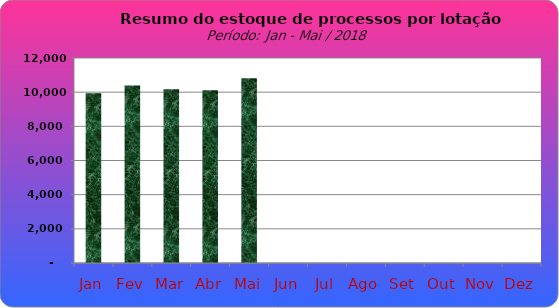
| Category | Series 0 |
|---|---|
| Jan | 9933 |
| Fev | 10393 |
| Mar | 10166 |
| Abr | 10112 |
| Mai | 10819 |
| Jun | 0 |
| Jul | 0 |
| Ago | 0 |
| Set | 0 |
| Out | 0 |
| Nov | 0 |
| Dez | 0 |